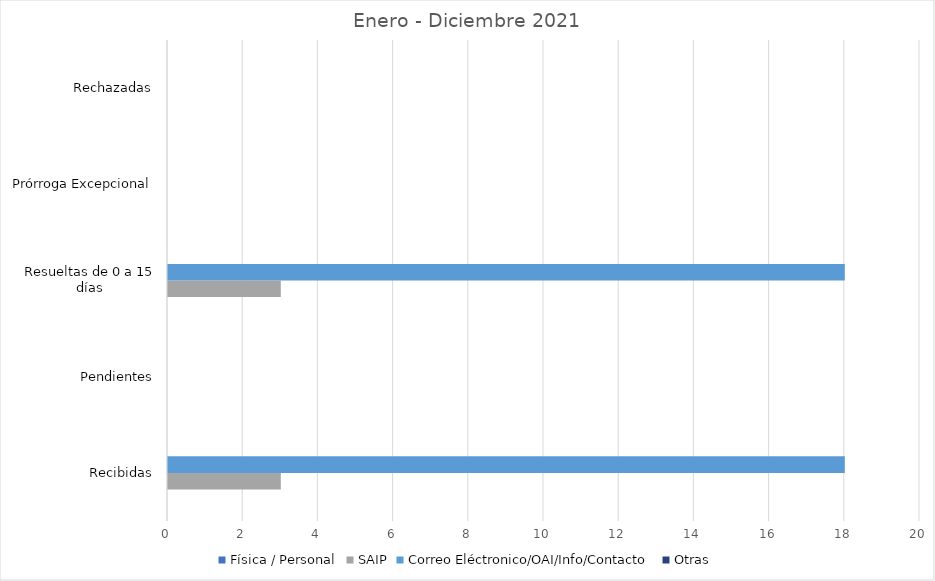
| Category | Física / Personal | SAIP | Correo Eléctronico/OAI/Info/Contacto | Otras |
|---|---|---|---|---|
| Recibidas | 0 | 3 | 18 | 0 |
| Pendientes | 0 | 0 | 0 | 0 |
| Resueltas de 0 a 15 días | 0 | 3 | 18 | 0 |
| Prórroga Excepcional | 0 | 0 | 0 | 0 |
| Rechazadas | 0 | 0 | 0 | 0 |